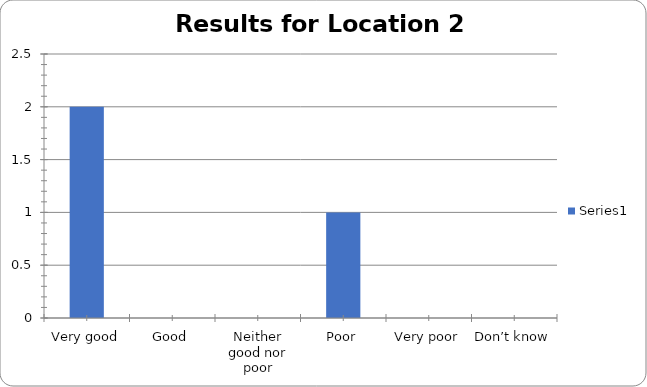
| Category | Series 0 |
|---|---|
| Very good | 2 |
| Good | 0 |
| Neither good nor poor | 0 |
| Poor | 1 |
| Very poor | 0 |
| Don’t know | 0 |